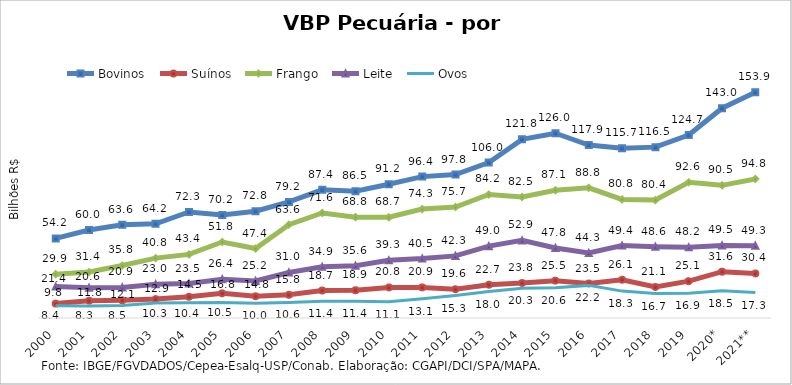
| Category | Bovinos | Suínos | Frango | Leite | Ovos |
|---|---|---|---|---|---|
| 2000 | 54.248 | 9.823 | 29.851 | 21.428 | 8.378 |
| 2001 | 59.967 | 11.784 | 31.375 | 20.619 | 8.256 |
| 2002 | 63.636 | 12.078 | 35.814 | 20.879 | 8.506 |
| 2003 | 64.225 | 12.908 | 40.831 | 22.992 | 10.289 |
| 2004 | 72.261 | 14.513 | 43.357 | 23.499 | 10.428 |
| 2005 | 70.155 | 16.826 | 51.836 | 26.43 | 10.499 |
| 2006 | 72.838 | 14.801 | 47.354 | 25.245 | 9.973 |
| 2007 | 79.158 | 15.827 | 63.625 | 31.035 | 10.599 |
| 2008 | 87.4 | 18.741 | 71.621 | 34.912 | 11.447 |
| 2009 | 86.489 | 18.944 | 68.766 | 35.594 | 11.413 |
| 2010 | 91.185 | 20.84 | 68.683 | 39.308 | 11.101 |
| 2011 | 96.397 | 20.873 | 74.284 | 40.522 | 13.08 |
| 2012 | 97.833 | 19.599 | 75.671 | 42.344 | 15.333 |
| 2013 | 106.017 | 22.692 | 84.222 | 49 | 18.034 |
| 2014 | 121.794 | 23.834 | 82.519 | 52.914 | 20.262 |
| 2015 | 125.986 | 25.472 | 87.114 | 47.764 | 20.631 |
| 2016 | 117.929 | 23.507 | 88.764 | 44.319 | 22.241 |
| 2017 | 115.727 | 26.095 | 80.848 | 49.381 | 18.333 |
| 2018 | 116.502 | 21.133 | 80.408 | 48.647 | 16.671 |
| 2019 | 124.748 | 25.119 | 92.581 | 48.196 | 16.883 |
| 2020* | 143.03 | 31.562 | 90.455 | 49.499 | 18.505 |
| 2021** | 153.915 | 30.374 | 94.799 | 49.343 | 17.305 |